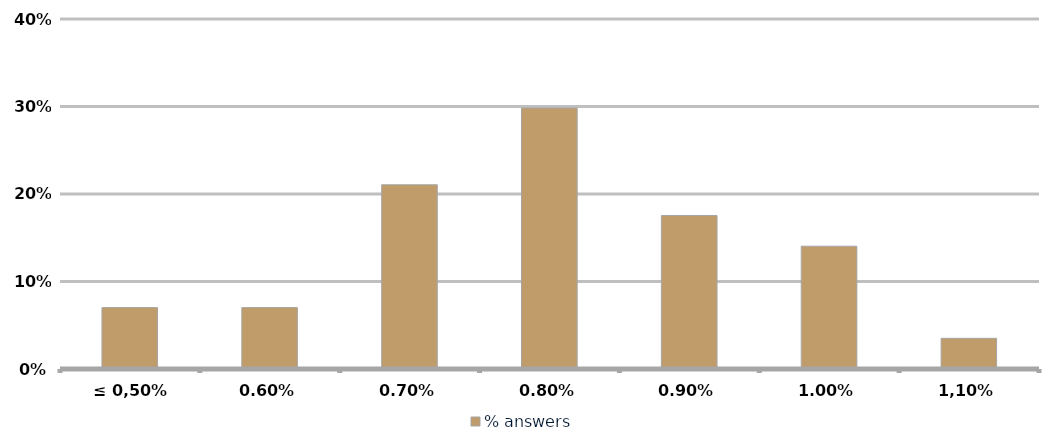
| Category | % answers |
|---|---|
| ≤ 0,50% | 0.07 |
| 0,60% | 0.07 |
| 0,70% | 0.211 |
| 0,80% | 0.298 |
| 0,90% | 0.175 |
| 1,00% | 0.14 |
| 1,10% | 0.035 |